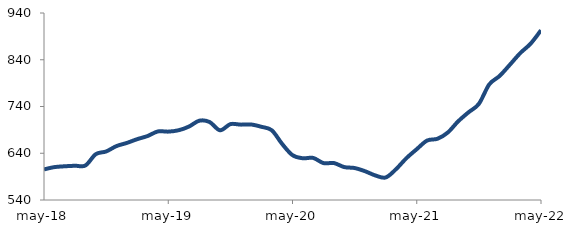
| Category | Series 0 |
|---|---|
| 2018-05-01 | 605.437 |
| 2018-06-01 | 610.334 |
| 2018-07-01 | 612.121 |
| 2018-08-01 | 613.247 |
| 2018-09-01 | 613.821 |
| 2018-10-01 | 638.011 |
| 2018-11-01 | 643.807 |
| 2018-12-01 | 655.34 |
| 2019-01-01 | 662.041 |
| 2019-02-01 | 670.134 |
| 2019-03-01 | 676.827 |
| 2019-04-01 | 686.669 |
| 2019-05-01 | 686.255 |
| 2019-06-01 | 689.181 |
| 2019-07-01 | 697.076 |
| 2019-08-01 | 709.635 |
| 2019-09-01 | 706.734 |
| 2019-10-01 | 689.137 |
| 2019-11-01 | 702.277 |
| 2019-12-01 | 701.214 |
| 2020-01-01 | 701.517 |
| 2020-02-01 | 696.552 |
| 2020-03-01 | 689.099 |
| 2020-04-01 | 659.896 |
| 2020-05-01 | 635.894 |
| 2020-06-01 | 629.29 |
| 2020-07-01 | 629.994 |
| 2020-08-01 | 618.866 |
| 2020-09-01 | 619.022 |
| 2020-10-01 | 610.428 |
| 2020-11-01 | 608.402 |
| 2020-12-01 | 601.605 |
| 2021-01-01 | 592.504 |
| 2021-02-01 | 588.185 |
| 2021-03-01 | 605.989 |
| 2021-04-01 | 629.446 |
| 2021-05-01 | 648.73 |
| 2021-06-01 | 667.177 |
| 2021-07-01 | 670.996 |
| 2021-08-01 | 684.389 |
| 2021-09-01 | 708.308 |
| 2021-10-01 | 727.608 |
| 2021-11-01 | 745.65 |
| 2021-12-01 | 787.184 |
| 2022-01-01 | 805.308 |
| 2022-02-01 | 829.502 |
| 2022-03-01 | 854.336 |
| 2022-04-01 | 874.453 |
| 2022-05-01 | 903.049 |